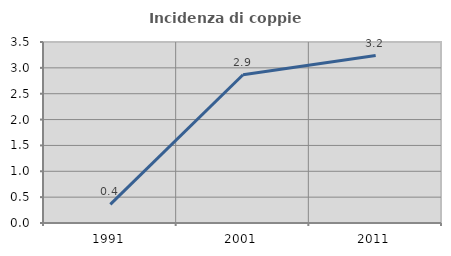
| Category | Incidenza di coppie miste |
|---|---|
| 1991.0 | 0.36 |
| 2001.0 | 2.867 |
| 2011.0 | 3.237 |